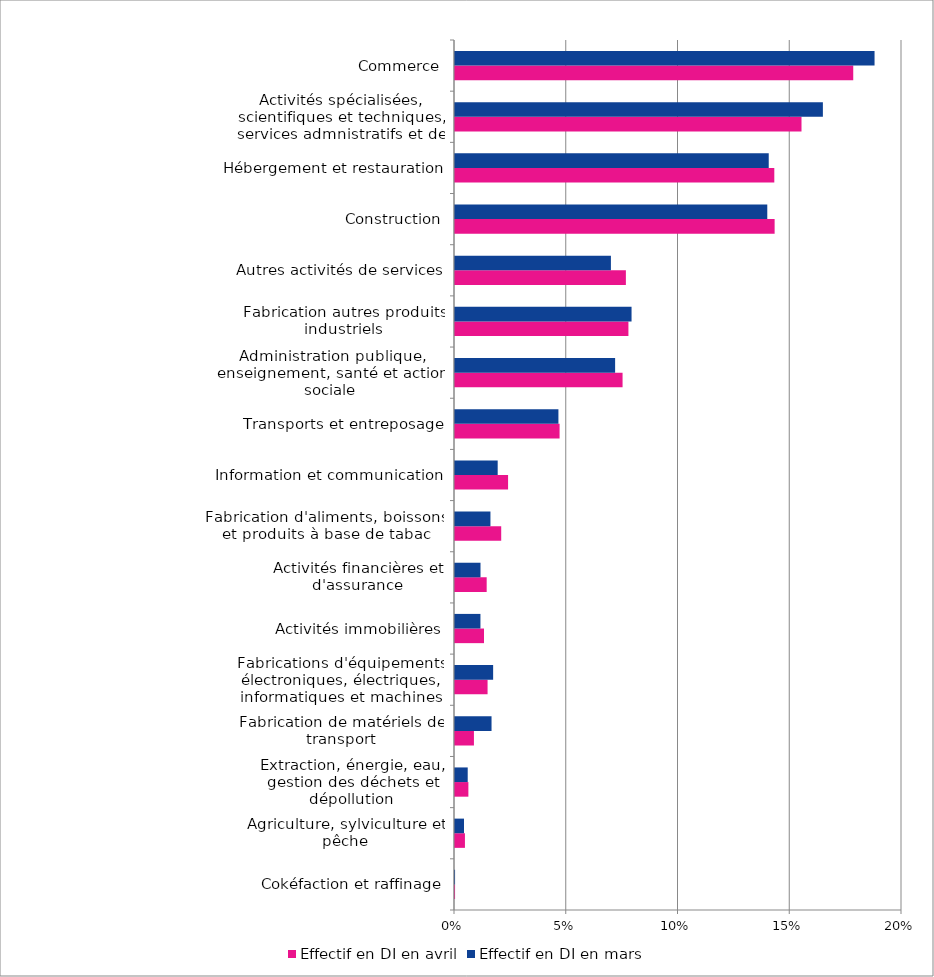
| Category | Effectif en DI en avril | Effectif en DI en mars |
|---|---|---|
| Cokéfaction et raffinage | 0 | 0 |
| Agriculture, sylviculture et pêche | 0.004 | 0.004 |
| Extraction, énergie, eau, gestion des déchets et dépollution | 0.006 | 0.006 |
| Fabrication de matériels de transport | 0.008 | 0.016 |
| Fabrications d'équipements électroniques, électriques, informatiques et machines | 0.015 | 0.017 |
| Activités immobilières | 0.013 | 0.011 |
| Activités financières et d'assurance | 0.014 | 0.011 |
| Fabrication d'aliments, boissons et produits à base de tabac | 0.021 | 0.016 |
| Information et communication | 0.024 | 0.019 |
| Transports et entreposage | 0.047 | 0.046 |
| Administration publique, enseignement, santé et action sociale | 0.075 | 0.072 |
| Fabrication autres produits industriels | 0.078 | 0.079 |
| Autres activités de services | 0.076 | 0.07 |
| Construction | 0.143 | 0.14 |
| Hébergement et restauration | 0.143 | 0.14 |
| Activités spécialisées, scientifiques et techniques, services admnistratifs et de soutien | 0.155 | 0.165 |
| Commerce | 0.178 | 0.188 |